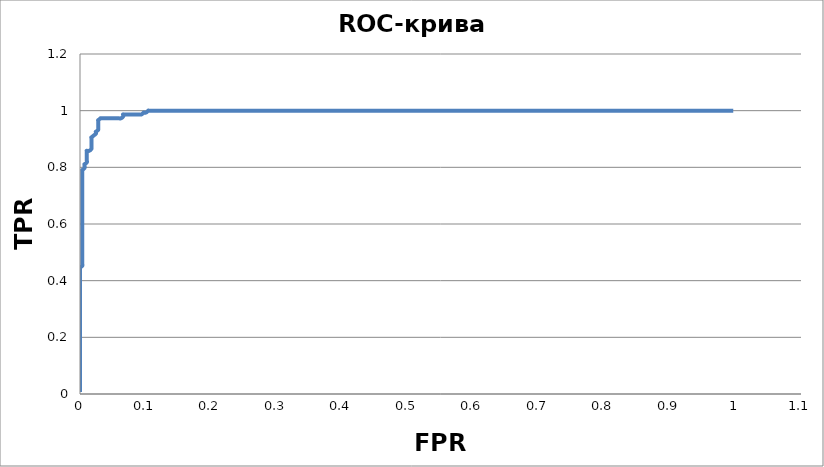
| Category | Series 0 |
|---|---|
| 0.0 | 0.007 |
| 0.0 | 0.014 |
| 0.0 | 0.02 |
| 0.0 | 0.027 |
| 0.0 | 0.034 |
| 0.0 | 0.041 |
| 0.0 | 0.047 |
| 0.0 | 0.054 |
| 0.0 | 0.061 |
| 0.0 | 0.068 |
| 0.0 | 0.074 |
| 0.0 | 0.081 |
| 0.0 | 0.088 |
| 0.0 | 0.095 |
| 0.0 | 0.101 |
| 0.0 | 0.108 |
| 0.0 | 0.115 |
| 0.0 | 0.122 |
| 0.0 | 0.128 |
| 0.0 | 0.135 |
| 0.0 | 0.142 |
| 0.0 | 0.149 |
| 0.0 | 0.155 |
| 0.0 | 0.162 |
| 0.0 | 0.169 |
| 0.0 | 0.176 |
| 0.0 | 0.182 |
| 0.0 | 0.189 |
| 0.0 | 0.196 |
| 0.0 | 0.203 |
| 0.0 | 0.209 |
| 0.0 | 0.216 |
| 0.0 | 0.223 |
| 0.0 | 0.23 |
| 0.0 | 0.236 |
| 0.0 | 0.243 |
| 0.0 | 0.25 |
| 0.0 | 0.257 |
| 0.0 | 0.264 |
| 0.0 | 0.27 |
| 0.0 | 0.277 |
| 0.0 | 0.284 |
| 0.0 | 0.291 |
| 0.0 | 0.297 |
| 0.0 | 0.304 |
| 0.0 | 0.311 |
| 0.0 | 0.318 |
| 0.0 | 0.324 |
| 0.0 | 0.331 |
| 0.0 | 0.338 |
| 0.0 | 0.345 |
| 0.0 | 0.351 |
| 0.0 | 0.358 |
| 0.0 | 0.365 |
| 0.0 | 0.372 |
| 0.0 | 0.378 |
| 0.0 | 0.385 |
| 0.0 | 0.392 |
| 0.0 | 0.399 |
| 0.0 | 0.405 |
| 0.0 | 0.412 |
| 0.0 | 0.419 |
| 0.0 | 0.426 |
| 0.0 | 0.432 |
| 0.0 | 0.439 |
| 0.0 | 0.446 |
| 0.0 | 0.446 |
| 0.00347222222222221 | 0.453 |
| 0.00347222222222221 | 0.459 |
| 0.00347222222222221 | 0.466 |
| 0.00347222222222221 | 0.473 |
| 0.00347222222222221 | 0.48 |
| 0.00347222222222221 | 0.486 |
| 0.00347222222222221 | 0.493 |
| 0.00347222222222221 | 0.5 |
| 0.00347222222222221 | 0.507 |
| 0.00347222222222221 | 0.514 |
| 0.00347222222222221 | 0.52 |
| 0.00347222222222221 | 0.527 |
| 0.00347222222222221 | 0.534 |
| 0.00347222222222221 | 0.541 |
| 0.00347222222222221 | 0.547 |
| 0.00347222222222221 | 0.554 |
| 0.00347222222222221 | 0.561 |
| 0.00347222222222221 | 0.568 |
| 0.00347222222222221 | 0.574 |
| 0.00347222222222221 | 0.581 |
| 0.00347222222222221 | 0.588 |
| 0.00347222222222221 | 0.595 |
| 0.00347222222222221 | 0.601 |
| 0.00347222222222221 | 0.608 |
| 0.00347222222222221 | 0.615 |
| 0.00347222222222221 | 0.622 |
| 0.00347222222222221 | 0.628 |
| 0.00347222222222221 | 0.635 |
| 0.00347222222222221 | 0.642 |
| 0.00347222222222221 | 0.649 |
| 0.00347222222222221 | 0.655 |
| 0.00347222222222221 | 0.662 |
| 0.00347222222222221 | 0.669 |
| 0.00347222222222221 | 0.676 |
| 0.00347222222222221 | 0.682 |
| 0.00347222222222221 | 0.689 |
| 0.00347222222222221 | 0.696 |
| 0.00347222222222221 | 0.703 |
| 0.00347222222222221 | 0.709 |
| 0.00347222222222221 | 0.716 |
| 0.00347222222222221 | 0.723 |
| 0.00347222222222221 | 0.73 |
| 0.00347222222222221 | 0.736 |
| 0.00347222222222221 | 0.743 |
| 0.00347222222222221 | 0.75 |
| 0.00347222222222221 | 0.757 |
| 0.00347222222222221 | 0.764 |
| 0.00347222222222221 | 0.77 |
| 0.00347222222222221 | 0.777 |
| 0.00347222222222221 | 0.784 |
| 0.00347222222222221 | 0.791 |
| 0.00347222222222221 | 0.791 |
| 0.00694444444444442 | 0.797 |
| 0.00694444444444442 | 0.804 |
| 0.00694444444444442 | 0.811 |
| 0.00694444444444442 | 0.811 |
| 0.01041666666666663 | 0.818 |
| 0.01041666666666663 | 0.824 |
| 0.01041666666666663 | 0.831 |
| 0.01041666666666663 | 0.838 |
| 0.01041666666666663 | 0.845 |
| 0.01041666666666663 | 0.851 |
| 0.01041666666666663 | 0.858 |
| 0.01041666666666663 | 0.858 |
| 0.01388888888888884 | 0.858 |
| 0.01736111111111116 | 0.865 |
| 0.01736111111111116 | 0.872 |
| 0.01736111111111116 | 0.878 |
| 0.01736111111111116 | 0.885 |
| 0.01736111111111116 | 0.892 |
| 0.01736111111111116 | 0.899 |
| 0.01736111111111116 | 0.905 |
| 0.01736111111111116 | 0.905 |
| 0.02083333333333337 | 0.912 |
| 0.02083333333333337 | 0.912 |
| 0.02430555555555558 | 0.919 |
| 0.02430555555555558 | 0.926 |
| 0.02430555555555558 | 0.926 |
| 0.02777777777777779 | 0.932 |
| 0.02777777777777779 | 0.939 |
| 0.02777777777777779 | 0.946 |
| 0.02777777777777779 | 0.953 |
| 0.02777777777777779 | 0.959 |
| 0.02777777777777779 | 0.966 |
| 0.02777777777777779 | 0.966 |
| 0.03125 | 0.973 |
| 0.03125 | 0.973 |
| 0.03472222222222221 | 0.973 |
| 0.03819444444444442 | 0.973 |
| 0.04166666666666663 | 0.973 |
| 0.04513888888888884 | 0.973 |
| 0.04861111111111116 | 0.973 |
| 0.05208333333333337 | 0.973 |
| 0.05555555555555558 | 0.973 |
| 0.05902777777777779 | 0.973 |
| 0.0625 | 0.973 |
| 0.06597222222222221 | 0.98 |
| 0.06597222222222221 | 0.986 |
| 0.06597222222222221 | 0.986 |
| 0.06944444444444442 | 0.986 |
| 0.07291666666666663 | 0.986 |
| 0.07638888888888884 | 0.986 |
| 0.07986111111111116 | 0.986 |
| 0.08333333333333337 | 0.986 |
| 0.08680555555555558 | 0.986 |
| 0.09027777777777779 | 0.986 |
| 0.09375 | 0.986 |
| 0.09722222222222221 | 0.993 |
| 0.09722222222222221 | 0.993 |
| 0.10069444444444442 | 0.993 |
| 0.10416666666666663 | 1 |
| 0.10416666666666663 | 1 |
| 0.10763888888888884 | 1 |
| 0.11111111111111116 | 1 |
| 0.11458333333333337 | 1 |
| 0.11805555555555558 | 1 |
| 0.12152777777777779 | 1 |
| 0.125 | 1 |
| 0.1284722222222222 | 1 |
| 0.13194444444444442 | 1 |
| 0.13541666666666663 | 1 |
| 0.13888888888888884 | 1 |
| 0.14236111111111116 | 1 |
| 0.14583333333333337 | 1 |
| 0.14930555555555558 | 1 |
| 0.1527777777777778 | 1 |
| 0.15625 | 1 |
| 0.1597222222222222 | 1 |
| 0.16319444444444442 | 1 |
| 0.16666666666666663 | 1 |
| 0.17013888888888884 | 1 |
| 0.17361111111111116 | 1 |
| 0.17708333333333337 | 1 |
| 0.18055555555555558 | 1 |
| 0.1840277777777778 | 1 |
| 0.1875 | 1 |
| 0.1909722222222222 | 1 |
| 0.19444444444444442 | 1 |
| 0.19791666666666663 | 1 |
| 0.20138888888888884 | 1 |
| 0.20486111111111116 | 1 |
| 0.20833333333333337 | 1 |
| 0.21180555555555558 | 1 |
| 0.2152777777777778 | 1 |
| 0.21875 | 1 |
| 0.2222222222222222 | 1 |
| 0.22569444444444442 | 1 |
| 0.22916666666666663 | 1 |
| 0.23263888888888884 | 1 |
| 0.23611111111111116 | 1 |
| 0.23958333333333337 | 1 |
| 0.24305555555555558 | 1 |
| 0.2465277777777778 | 1 |
| 0.25 | 1 |
| 0.2534722222222222 | 1 |
| 0.2569444444444444 | 1 |
| 0.26041666666666663 | 1 |
| 0.26388888888888884 | 1 |
| 0.26736111111111116 | 1 |
| 0.27083333333333337 | 1 |
| 0.2743055555555556 | 1 |
| 0.2777777777777778 | 1 |
| 0.28125 | 1 |
| 0.2847222222222222 | 1 |
| 0.2881944444444444 | 1 |
| 0.29166666666666663 | 1 |
| 0.29513888888888884 | 1 |
| 0.29861111111111116 | 1 |
| 0.30208333333333337 | 1 |
| 0.3055555555555556 | 1 |
| 0.3090277777777778 | 1 |
| 0.3125 | 1 |
| 0.3159722222222222 | 1 |
| 0.3194444444444444 | 1 |
| 0.32291666666666663 | 1 |
| 0.32638888888888884 | 1 |
| 0.32986111111111116 | 1 |
| 0.33333333333333337 | 1 |
| 0.3368055555555556 | 1 |
| 0.3402777777777778 | 1 |
| 0.34375 | 1 |
| 0.3472222222222222 | 1 |
| 0.3506944444444444 | 1 |
| 0.35416666666666663 | 1 |
| 0.35763888888888884 | 1 |
| 0.36111111111111116 | 1 |
| 0.36458333333333337 | 1 |
| 0.3680555555555556 | 1 |
| 0.3715277777777778 | 1 |
| 0.375 | 1 |
| 0.3784722222222222 | 1 |
| 0.3819444444444444 | 1 |
| 0.38541666666666663 | 1 |
| 0.38888888888888884 | 1 |
| 0.39236111111111116 | 1 |
| 0.39583333333333337 | 1 |
| 0.3993055555555556 | 1 |
| 0.4027777777777778 | 1 |
| 0.40625 | 1 |
| 0.4097222222222222 | 1 |
| 0.4131944444444444 | 1 |
| 0.41666666666666663 | 1 |
| 0.42013888888888884 | 1 |
| 0.42361111111111116 | 1 |
| 0.42708333333333337 | 1 |
| 0.4305555555555556 | 1 |
| 0.4340277777777778 | 1 |
| 0.4375 | 1 |
| 0.4409722222222222 | 1 |
| 0.4444444444444444 | 1 |
| 0.44791666666666663 | 1 |
| 0.45138888888888884 | 1 |
| 0.45486111111111116 | 1 |
| 0.45833333333333337 | 1 |
| 0.4618055555555556 | 1 |
| 0.4652777777777778 | 1 |
| 0.46875 | 1 |
| 0.4722222222222222 | 1 |
| 0.4756944444444444 | 1 |
| 0.47916666666666663 | 1 |
| 0.48263888888888884 | 1 |
| 0.48611111111111116 | 1 |
| 0.48958333333333337 | 1 |
| 0.4930555555555556 | 1 |
| 0.4965277777777778 | 1 |
| 0.5 | 1 |
| 0.5034722222222222 | 1 |
| 0.5069444444444444 | 1 |
| 0.5104166666666667 | 1 |
| 0.5138888888888888 | 1 |
| 0.5173611111111112 | 1 |
| 0.5208333333333333 | 1 |
| 0.5243055555555556 | 1 |
| 0.5277777777777778 | 1 |
| 0.53125 | 1 |
| 0.5347222222222222 | 1 |
| 0.5381944444444444 | 1 |
| 0.5416666666666667 | 1 |
| 0.5451388888888888 | 1 |
| 0.5486111111111112 | 1 |
| 0.5520833333333333 | 1 |
| 0.5555555555555556 | 1 |
| 0.5590277777777778 | 1 |
| 0.5625 | 1 |
| 0.5659722222222222 | 1 |
| 0.5694444444444444 | 1 |
| 0.5729166666666667 | 1 |
| 0.5763888888888888 | 1 |
| 0.5798611111111112 | 1 |
| 0.5833333333333333 | 1 |
| 0.5868055555555556 | 1 |
| 0.5902777777777778 | 1 |
| 0.59375 | 1 |
| 0.5972222222222222 | 1 |
| 0.6006944444444444 | 1 |
| 0.6041666666666667 | 1 |
| 0.6076388888888888 | 1 |
| 0.6111111111111112 | 1 |
| 0.6145833333333333 | 1 |
| 0.6180555555555556 | 1 |
| 0.6215277777777778 | 1 |
| 0.625 | 1 |
| 0.6284722222222222 | 1 |
| 0.6319444444444444 | 1 |
| 0.6354166666666667 | 1 |
| 0.6388888888888888 | 1 |
| 0.6423611111111112 | 1 |
| 0.6458333333333333 | 1 |
| 0.6493055555555556 | 1 |
| 0.6527777777777778 | 1 |
| 0.65625 | 1 |
| 0.6597222222222222 | 1 |
| 0.6631944444444444 | 1 |
| 0.6666666666666667 | 1 |
| 0.6701388888888888 | 1 |
| 0.6736111111111112 | 1 |
| 0.6770833333333333 | 1 |
| 0.6805555555555556 | 1 |
| 0.6840277777777778 | 1 |
| 0.6875 | 1 |
| 0.6909722222222222 | 1 |
| 0.6944444444444444 | 1 |
| 0.6979166666666667 | 1 |
| 0.7013888888888888 | 1 |
| 0.7048611111111112 | 1 |
| 0.7083333333333333 | 1 |
| 0.7118055555555556 | 1 |
| 0.7152777777777778 | 1 |
| 0.71875 | 1 |
| 0.7222222222222222 | 1 |
| 0.7256944444444444 | 1 |
| 0.7291666666666667 | 1 |
| 0.7326388888888888 | 1 |
| 0.7361111111111112 | 1 |
| 0.7395833333333333 | 1 |
| 0.7430555555555556 | 1 |
| 0.7465277777777778 | 1 |
| 0.75 | 1 |
| 0.7534722222222222 | 1 |
| 0.7569444444444444 | 1 |
| 0.7604166666666666 | 1 |
| 0.7638888888888888 | 1 |
| 0.7673611111111112 | 1 |
| 0.7708333333333334 | 1 |
| 0.7743055555555556 | 1 |
| 0.7777777777777778 | 1 |
| 0.78125 | 1 |
| 0.7847222222222222 | 1 |
| 0.7881944444444444 | 1 |
| 0.7916666666666666 | 1 |
| 0.7951388888888888 | 1 |
| 0.7986111111111112 | 1 |
| 0.8020833333333334 | 1 |
| 0.8055555555555556 | 1 |
| 0.8090277777777778 | 1 |
| 0.8125 | 1 |
| 0.8159722222222222 | 1 |
| 0.8194444444444444 | 1 |
| 0.8229166666666666 | 1 |
| 0.8263888888888888 | 1 |
| 0.8298611111111112 | 1 |
| 0.8333333333333334 | 1 |
| 0.8368055555555556 | 1 |
| 0.8402777777777778 | 1 |
| 0.84375 | 1 |
| 0.8472222222222222 | 1 |
| 0.8506944444444444 | 1 |
| 0.8541666666666666 | 1 |
| 0.8576388888888888 | 1 |
| 0.8611111111111112 | 1 |
| 0.8645833333333334 | 1 |
| 0.8680555555555556 | 1 |
| 0.8715277777777778 | 1 |
| 0.875 | 1 |
| 0.8784722222222222 | 1 |
| 0.8819444444444444 | 1 |
| 0.8854166666666666 | 1 |
| 0.8888888888888888 | 1 |
| 0.8923611111111112 | 1 |
| 0.8958333333333334 | 1 |
| 0.8993055555555556 | 1 |
| 0.9027777777777778 | 1 |
| 0.90625 | 1 |
| 0.9097222222222222 | 1 |
| 0.9131944444444444 | 1 |
| 0.9166666666666666 | 1 |
| 0.9201388888888888 | 1 |
| 0.9236111111111112 | 1 |
| 0.9270833333333334 | 1 |
| 0.9305555555555556 | 1 |
| 0.9340277777777778 | 1 |
| 0.9375 | 1 |
| 0.9409722222222222 | 1 |
| 0.9444444444444444 | 1 |
| 0.9479166666666666 | 1 |
| 0.9513888888888888 | 1 |
| 0.9548611111111112 | 1 |
| 0.9583333333333334 | 1 |
| 0.9618055555555556 | 1 |
| 0.9652777777777778 | 1 |
| 0.96875 | 1 |
| 0.9722222222222222 | 1 |
| 0.9756944444444444 | 1 |
| 0.9791666666666666 | 1 |
| 0.9826388888888888 | 1 |
| 0.9861111111111112 | 1 |
| 0.9895833333333334 | 1 |
| 0.9930555555555556 | 1 |
| 0.9965277777777778 | 1 |